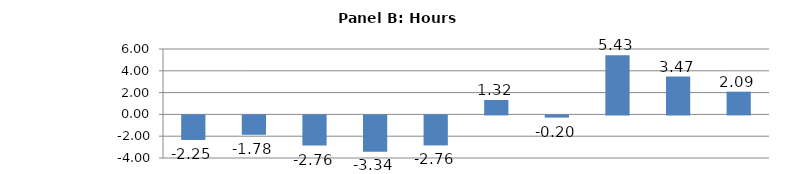
| Category | Series 0 |
|---|---|
| Crop and animal production | -2.252 |
| Wood product manufacturing | -1.781 |
| Forestry and logging | -2.763 |
| Fishing, hunting and trapping | -3.34 |
| Paper manufacturing | -2.755 |
| Support activities for agriculture and forestry | 1.324 |
| Mining (except oil and gas) | -0.201 |
| Support activities for mining and oil and gas | 5.429 |
| Oil and gas extraction | 3.468 |
| Petroleum and coal products manufacturing | 2.085 |